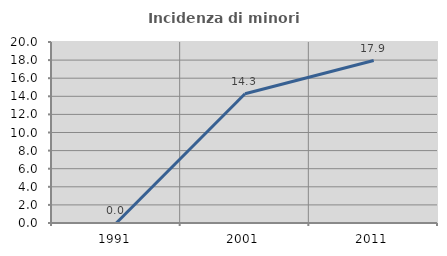
| Category | Incidenza di minori stranieri |
|---|---|
| 1991.0 | 0 |
| 2001.0 | 14.286 |
| 2011.0 | 17.949 |